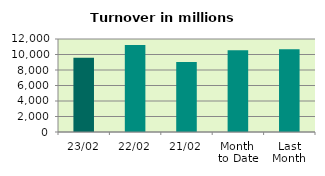
| Category | Series 0 |
|---|---|
| 23/02 | 9574.136 |
| 22/02 | 11234.982 |
| 21/02 | 9027.64 |
| Month 
to Date | 10549.071 |
| Last
Month | 10672.471 |